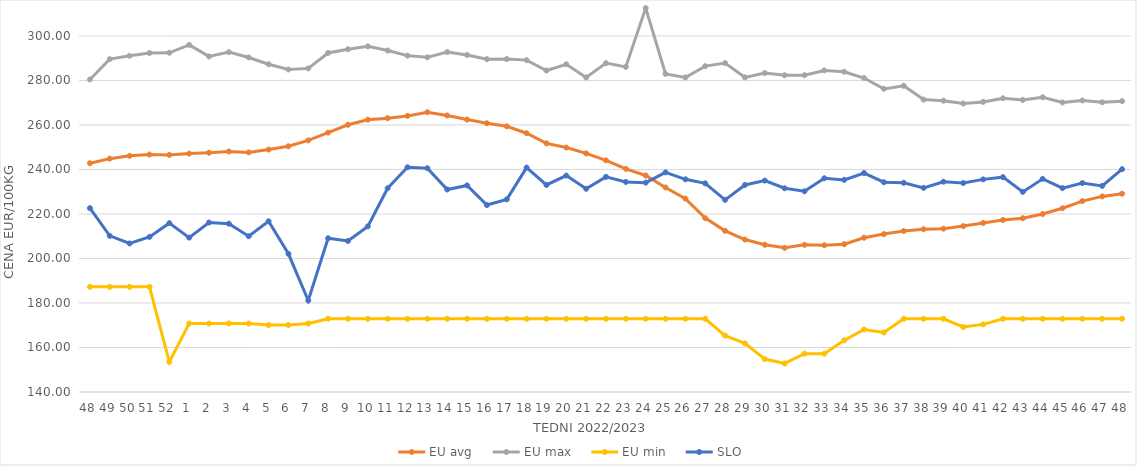
| Category | EU avg | EU max | EU min | SLO |
|---|---|---|---|---|
| 48.0 | 242.81 | 280.434 | 187.26 | 222.61 |
| 49.0 | 244.854 | 289.585 | 187.26 | 210.16 |
| 50.0 | 246.132 | 291.057 | 187.26 | 206.76 |
| 51.0 | 246.705 | 292.307 | 187.26 | 209.69 |
| 52.0 | 246.546 | 292.426 | 153.54 | 215.87 |
| 1.0 | 247.118 | 295.98 | 170.79 | 209.37 |
| 2.0 | 247.516 | 290.8 | 170.79 | 216.15 |
| 3.0 | 248.079 | 292.71 | 170.79 | 215.63 |
| 4.0 | 247.672 | 290.32 | 170.79 | 210 |
| 5.0 | 248.924 | 287.27 | 170.09 | 216.7 |
| 6.0 | 250.4 | 284.92 | 170.09 | 202.1 |
| 7.0 | 253.074 | 285.42 | 170.79 | 181.11 |
| 8.0 | 256.543 | 292.35 | 172.91 | 209.08 |
| 9.0 | 260.066 | 294.02 | 172.91 | 207.87 |
| 10.0 | 262.352 | 295.33 | 172.91 | 214.42 |
| 11.0 | 263.049 | 293.44 | 172.91 | 231.56 |
| 12.0 | 264.068 | 291.15 | 172.91 | 240.97 |
| 13.0 | 265.73 | 290.38 | 172.91 | 240.55 |
| 14.0 | 264.262 | 292.763 | 172.91 | 230.99 |
| 15.0 | 262.411 | 291.46 | 172.91 | 232.82 |
| 16.0 | 260.77 | 289.56 | 172.91 | 224 |
| 17.0 | 259.395 | 289.61 | 172.91 | 226.57 |
| 18.0 | 256.275 | 289.13 | 172.91 | 240.83 |
| 19.0 | 251.716 | 284.45 | 172.91 | 233.05 |
| 20.0 | 249.836 | 287.26 | 172.91 | 237.25 |
| 21.0 | 247.212 | 281.33 | 172.91 | 231.3 |
| 22.0 | 244.103 | 287.77 | 172.91 | 236.67 |
| 23.0 | 240.279 | 286.1 | 172.91 | 234.39 |
| 24.0 | 237.289 | 312.54 | 172.91 | 234.08 |
| 25.0 | 231.895 | 282.95 | 172.91 | 238.69 |
| 26.0 | 226.903 | 281.34 | 172.91 | 235.57 |
| 27.0 | 218.126 | 286.43 | 172.91 | 233.75 |
| 28.0 | 212.406 | 287.8 | 165.32 | 226.35 |
| 29.0 | 208.504 | 281.37 | 161.87 | 233.03 |
| 30.0 | 206.149 | 283.3 | 154.8 | 235 |
| 31.0 | 204.79 | 282.32 | 152.83 | 231.55 |
| 32.0 | 206.16 | 282.36 | 157.23 | 230.2 |
| 33.0 | 205.917 | 284.5 | 157.23 | 236.04 |
| 34.0 | 206.436 | 283.9 | 163.21 | 235.32 |
| 35.0 | 209.326 | 281.09 | 168.085 | 238.39 |
| 36.0 | 210.957 | 276.21 | 166.745 | 234.27 |
| 37.0 | 212.325 | 277.59 | 172.91 | 234 |
| 38.0 | 213.132 | 271.4 | 172.91 | 231.74 |
| 39.0 | 213.398 | 270.91 | 172.91 | 234.5 |
| 40.0 | 214.548 | 269.62 | 169.209 | 233.92 |
| 41.0 | 215.966 | 270.36 | 170.387 | 235.54 |
| 42.0 | 217.294 | 271.99 | 172.91 | 236.54 |
| 43.0 | 218.091 | 271.22 | 172.91 | 229.92 |
| 44.0 | 219.965 | 272.45 | 172.91 | 235.77 |
| 45.0 | 222.584 | 270.09 | 172.91 | 231.6 |
| 46.0 | 225.795 | 270.99 | 172.91 | 233.89 |
| 47.0 | 227.893 | 270.18 | 172.91 | 232.62 |
| 48.0 | 229.095 | 270.7 | 172.91 | 240.11 |